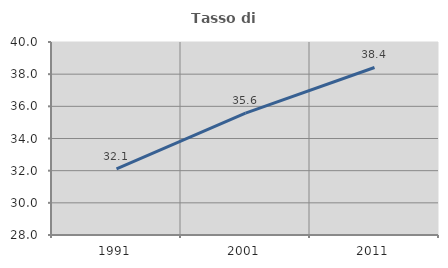
| Category | Tasso di occupazione   |
|---|---|
| 1991.0 | 32.111 |
| 2001.0 | 35.579 |
| 2011.0 | 38.415 |